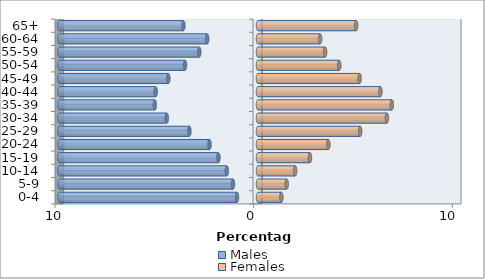
| Category | Males | Females |
|---|---|---|
| 0-4 | -1.057 | 1.178 |
| 5-9 | -1.258 | 1.444 |
| 10-14 | -1.571 | 1.87 |
| 15-19 | -1.993 | 2.615 |
| 20-24 | -2.441 | 3.54 |
| 25-29 | -3.454 | 5.142 |
| 30-34 | -4.592 | 6.489 |
| 35-39 | -5.194 | 6.736 |
| 40-44 | -5.15 | 6.163 |
| 45-49 | -4.515 | 5.117 |
| 50-54 | -3.674 | 4.09 |
| 55-59 | -2.956 | 3.378 |
| 60-64 | -2.558 | 3.128 |
| 65+ | -3.756 | 4.938 |